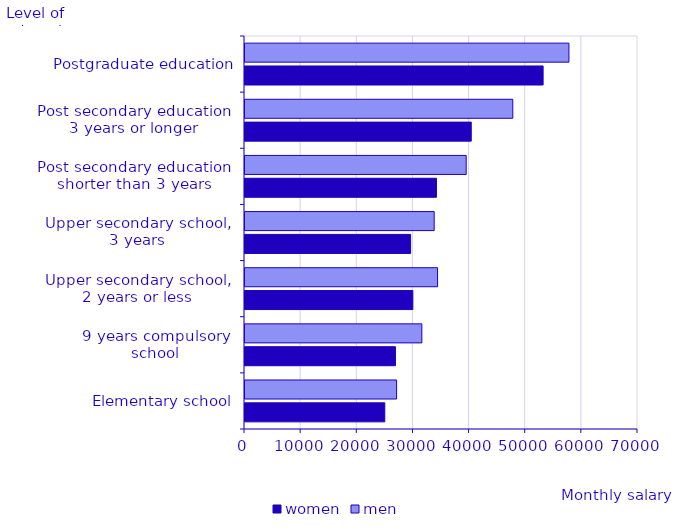
| Category | women | men |
|---|---|---|
| Elementary school | 24900 | 27000 |
| 9 years compulsory
school | 26800 | 31500 |
| Upper secondary school,
2 years or less | 29900 | 34300 |
| Upper secondary school,
3 years | 29500 | 33700 |
| Post secondary education
shorter than 3 years | 34100 | 39400 |
| Post secondary education
3 years or longer | 40300 | 47700 |
| Postgraduate education | 53100 | 57700 |